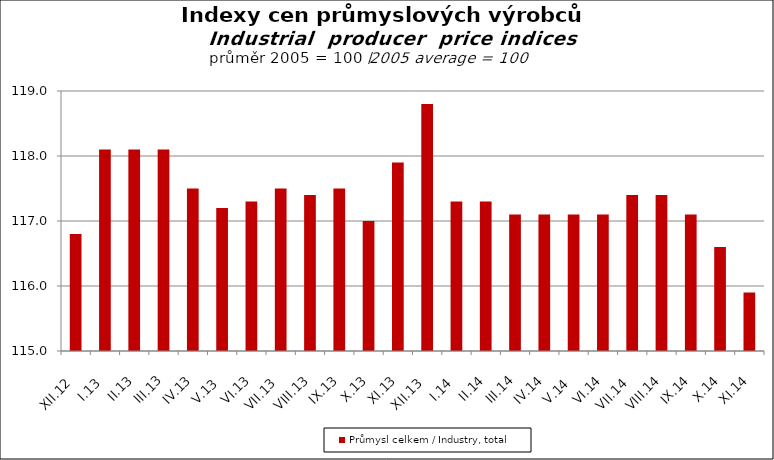
| Category | Průmysl celkem / Industry, total |
|---|---|
| XII.12 | 116.8 |
| I.13 | 118.1 |
| II.13 | 118.1 |
| III.13 | 118.1 |
| IV.13 | 117.5 |
| V.13 | 117.2 |
| VI.13 | 117.3 |
| VII.13 | 117.5 |
| VIII.13 | 117.4 |
| IX.13 | 117.5 |
| X.13 | 117 |
| XI.13 | 117.9 |
| XII.13 | 118.8 |
| I.14 | 117.3 |
| II.14 | 117.3 |
| III.14 | 117.1 |
| IV.14 | 117.1 |
| V.14 | 117.1 |
| VI.14 | 117.1 |
| VII.14 | 117.4 |
| VIII.14 | 117.4 |
| IX.14 | 117.1 |
| X.14 | 116.6 |
| XI.14 | 115.9 |